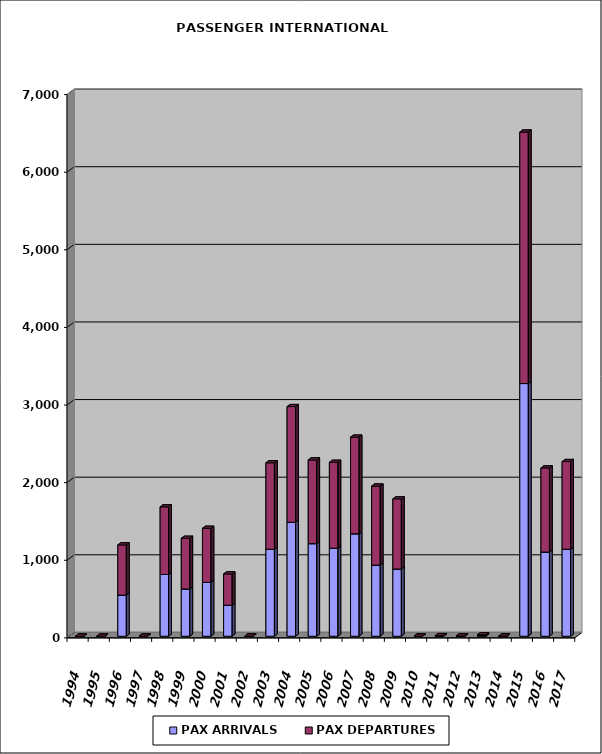
| Category | PAX ARRIVALS | PAX DEPARTURES |
|---|---|---|
| 1994.0 | 0 | 0 |
| 1995.0 | 0 | 0 |
| 1996.0 | 530 | 647 |
| 1997.0 | 0 | 0 |
| 1998.0 | 796 | 871 |
| 1999.0 | 609 | 653 |
| 2000.0 | 695 | 696 |
| 2001.0 | 400 | 403 |
| 2002.0 | 0 | 0 |
| 2003.0 | 1121 | 1114 |
| 2004.0 | 1468 | 1491 |
| 2005.0 | 1193 | 1078 |
| 2006.0 | 1134 | 1107 |
| 2007.0 | 1320 | 1245 |
| 2008.0 | 916 | 1019 |
| 2009.0 | 866 | 904 |
| 2010.0 | 0 | 0 |
| 2011.0 | 4 | 4 |
| 2012.0 | 2 | 2 |
| 2013.0 | 9 | 10 |
| 2014.0 | 0 | 2 |
| 2015.0 | 3256 | 3240 |
| 2016.0 | 1085 | 1083 |
| 2017.0 | 1122 | 1129 |